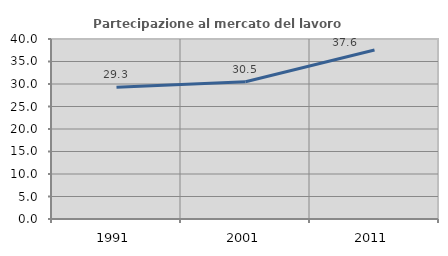
| Category | Partecipazione al mercato del lavoro  femminile |
|---|---|
| 1991.0 | 29.303 |
| 2001.0 | 30.493 |
| 2011.0 | 37.561 |